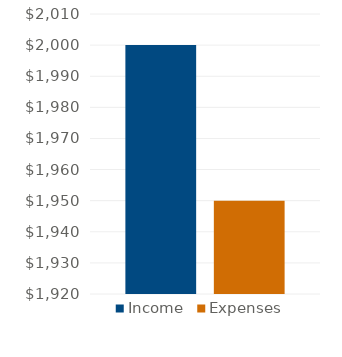
| Category | Income | Expenses |
|---|---|---|
| 0 | 2000 | 1950 |